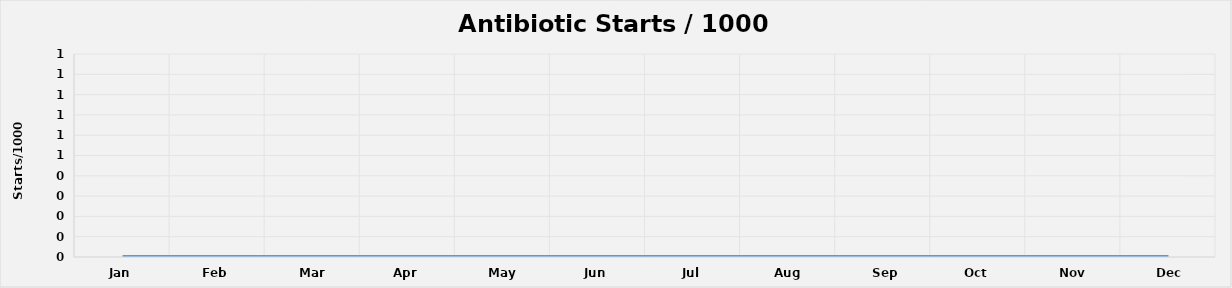
| Category | Antibiotic Start / 1000 RD |
|---|---|
| Jan | 0 |
| Feb | 0 |
| Mar | 0 |
| Apr | 0 |
| May | 0 |
| Jun | 0 |
| Jul | 0 |
| Aug | 0 |
| Sep | 0 |
| Oct | 0 |
| Nov | 0 |
| Dec | 0 |